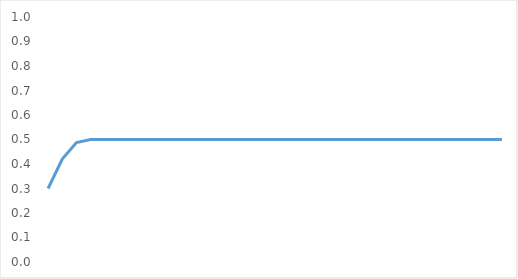
| Category | Series 0 |
|---|---|
| 0 | 0.3 |
| 1 | 0.42 |
| 2 | 0.487 |
| 3 | 0.5 |
| 4 | 0.5 |
| 5 | 0.5 |
| 6 | 0.5 |
| 7 | 0.5 |
| 8 | 0.5 |
| 9 | 0.5 |
| 10 | 0.5 |
| 11 | 0.5 |
| 12 | 0.5 |
| 13 | 0.5 |
| 14 | 0.5 |
| 15 | 0.5 |
| 16 | 0.5 |
| 17 | 0.5 |
| 18 | 0.5 |
| 19 | 0.5 |
| 20 | 0.5 |
| 21 | 0.5 |
| 22 | 0.5 |
| 23 | 0.5 |
| 24 | 0.5 |
| 25 | 0.5 |
| 26 | 0.5 |
| 27 | 0.5 |
| 28 | 0.5 |
| 29 | 0.5 |
| 30 | 0.5 |
| 31 | 0.5 |
| 32 | 0.5 |